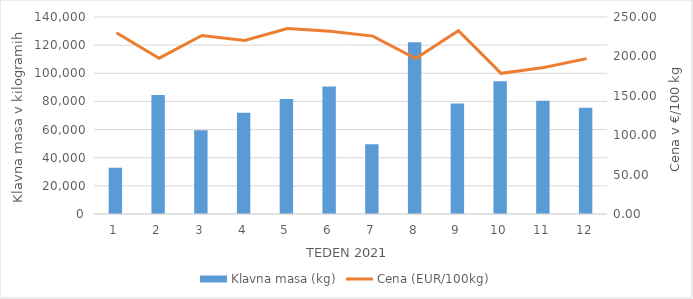
| Category | Klavna masa (kg) |
|---|---|
| 1.0 | 32871 |
| 2.0 | 84639 |
| 3.0 | 59476 |
| 4.0 | 72013 |
| 5.0 | 81759 |
| 6.0 | 90669 |
| 7.0 | 49517 |
| 8.0 | 122111 |
| 9.0 | 78545 |
| 10.0 | 94384 |
| 11.0 | 80405 |
| 12.0 | 75534 |